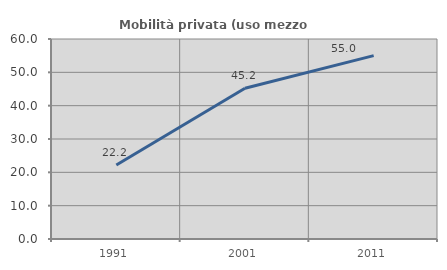
| Category | Mobilità privata (uso mezzo privato) |
|---|---|
| 1991.0 | 22.222 |
| 2001.0 | 45.238 |
| 2011.0 | 55.024 |